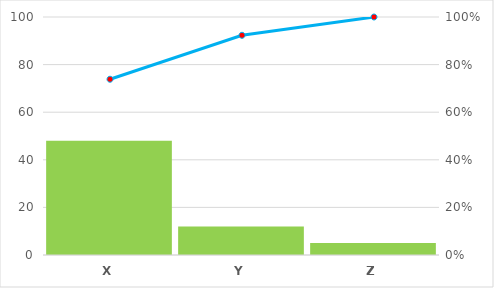
| Category | Series 0 |
|---|---|
| X | 48 |
| Y | 12 |
| Z | 5 |